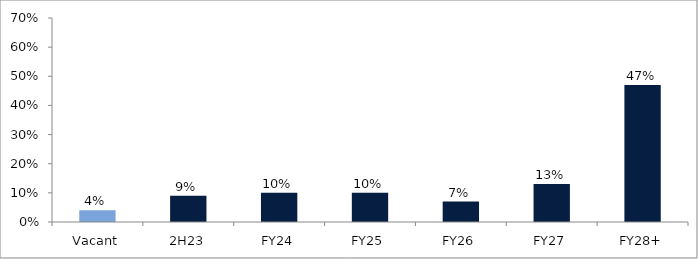
| Category | Series 0 |
|---|---|
| Vacant | 0.04 |
| 2H23 | 0.09 |
| FY24 | 0.1 |
| FY25 | 0.1 |
| FY26 | 0.07 |
| FY27 | 0.13 |
| FY28+ | 0.47 |